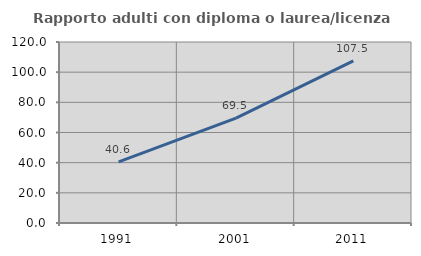
| Category | Rapporto adulti con diploma o laurea/licenza media  |
|---|---|
| 1991.0 | 40.581 |
| 2001.0 | 69.526 |
| 2011.0 | 107.539 |